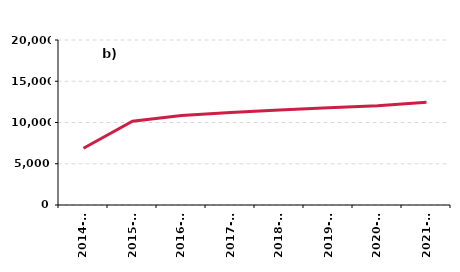
| Category | Biomass |
|---|---|
| 2014-15 | 6883 |
| 2015-16 | 10158 |
| 2016-17 | 10849 |
| 2017-18 | 11220 |
| 2018-19 | 11505 |
| 2019-20 | 11793 |
| 2020-21 | 12017 |
| 2021-22 | 12460 |